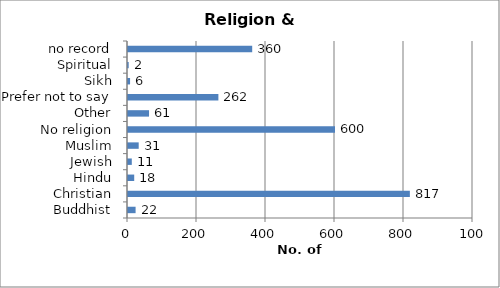
| Category | Number of people |
|---|---|
| Buddhist | 22 |
| Christian | 817 |
| Hindu | 18 |
| Jewish | 11 |
| Muslim | 31 |
| No religion | 600 |
| Other | 61 |
| Prefer not to say | 262 |
| Sikh | 6 |
| Spiritual | 2 |
| no record | 360 |